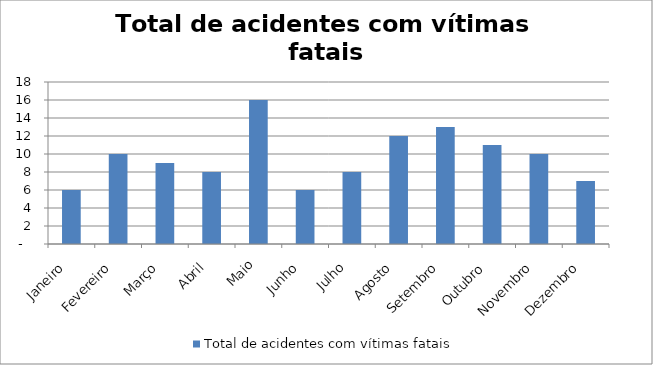
| Category | Total de acidentes com vítimas fatais |
|---|---|
| Janeiro | 6 |
| Fevereiro | 10 |
| Março | 9 |
| Abril | 8 |
| Maio | 16 |
| Junho | 6 |
| Julho | 8 |
| Agosto | 12 |
| Setembro | 13 |
| Outubro | 11 |
| Novembro | 10 |
| Dezembro | 7 |